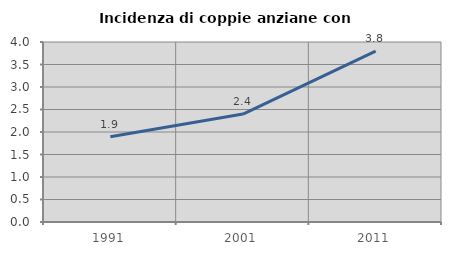
| Category | Incidenza di coppie anziane con figli |
|---|---|
| 1991.0 | 1.895 |
| 2001.0 | 2.398 |
| 2011.0 | 3.796 |